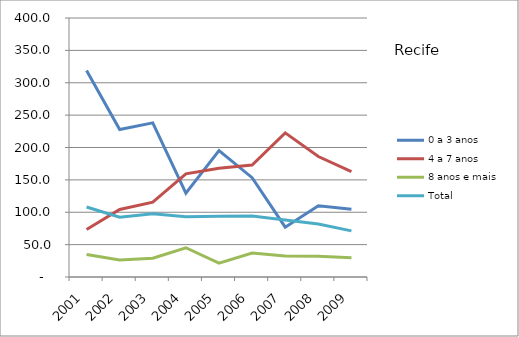
| Category | 0 a 3 anos | 4 a 7 anos | 8 anos e mais | Total |
|---|---|---|---|---|
| 2001.0 | 318.8 | 73.4 | 34.8 | 108.1 |
| 2002.0 | 227.7 | 104.2 | 26.1 | 92.2 |
| 2003.0 | 238 | 115.6 | 28.9 | 97.8 |
| 2004.0 | 129.6 | 159.3 | 45.2 | 93.1 |
| 2005.0 | 195.1 | 168 | 21.4 | 93.7 |
| 2006.0 | 153.4 | 172.8 | 36.9 | 94.3 |
| 2007.0 | 76.9 | 222.6 | 32.4 | 87.9 |
| 2008.0 | 110.1 | 186 | 32.2 | 81.8 |
| 2009.0 | 104.8 | 162.9 | 29.9 | 71.2 |